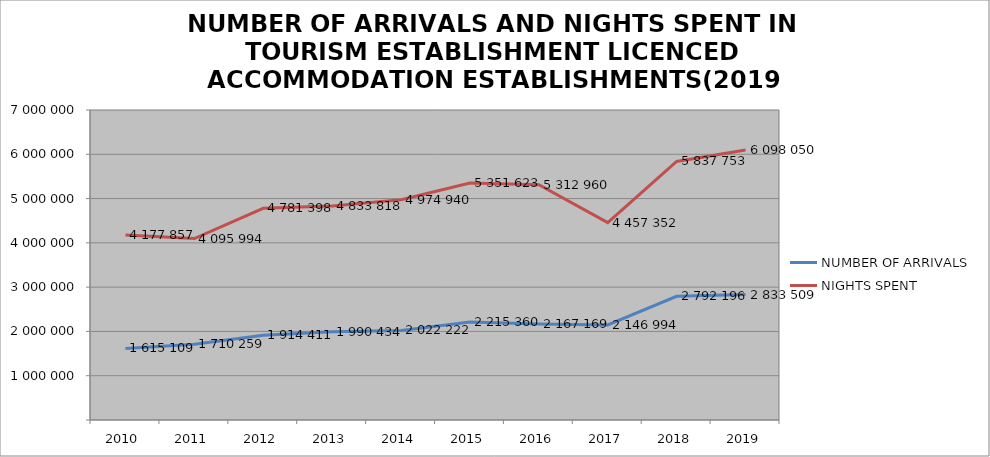
| Category | NUMBER OF ARRIVALS | NIGHTS SPENT |
|---|---|---|
| 2010 | 1615109 | 4177857 |
| 2011 | 1710259 | 4095994 |
| 2012 | 1914411 | 4781398 |
| 2013 | 1990434 | 4833818 |
| 2014 | 2022222 | 4974940 |
| 2015 | 2215360 | 5351623 |
| 2016 | 2167169 | 5312960 |
| 2017 | 2146994 | 4457352 |
| 2018 | 2792196 | 5837753 |
| 2019 | 2833509 | 6098050 |